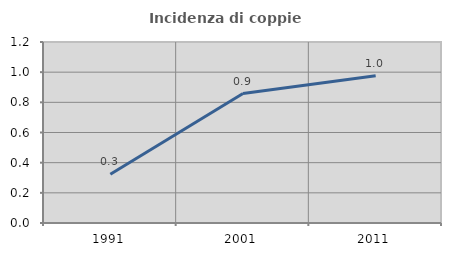
| Category | Incidenza di coppie miste |
|---|---|
| 1991.0 | 0.323 |
| 2001.0 | 0.858 |
| 2011.0 | 0.976 |